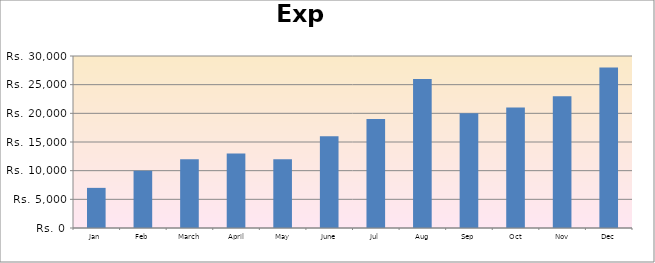
| Category | Revenue |
|---|---|
| Jan  | 7000 |
| Feb | 10000 |
| March | 12000 |
| April | 13000 |
| May | 12000 |
| June | 16000 |
| Jul | 19000 |
| Aug | 26000 |
| Sep | 20000 |
| Oct | 21000 |
| Nov | 23000 |
| Dec | 28000 |